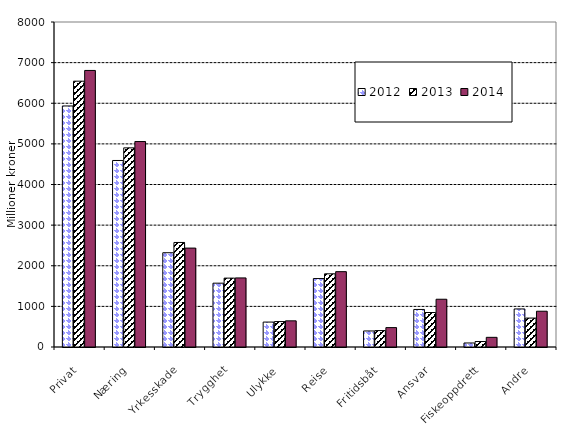
| Category | 2012 | 2013 | 2014 |
|---|---|---|---|
| Privat | 5933.149 | 6543.143 | 6807.421 |
| Næring | 4591.221 | 4901.714 | 5057.481 |
| Yrkesskade | 2320.418 | 2573.205 | 2434.749 |
| Trygghet | 1570.886 | 1695.525 | 1700.247 |
| Ulykke | 613.828 | 625.949 | 643.955 |
| Reise | 1684.937 | 1801.514 | 1854.319 |
| Fritidsbåt | 394.804 | 404.534 | 477.564 |
| Ansvar | 924.24 | 849.168 | 1175.414 |
| Fiskeoppdrett | 99.057 | 134.623 | 238.075 |
| Andre | 936.878 | 712.197 | 880.462 |